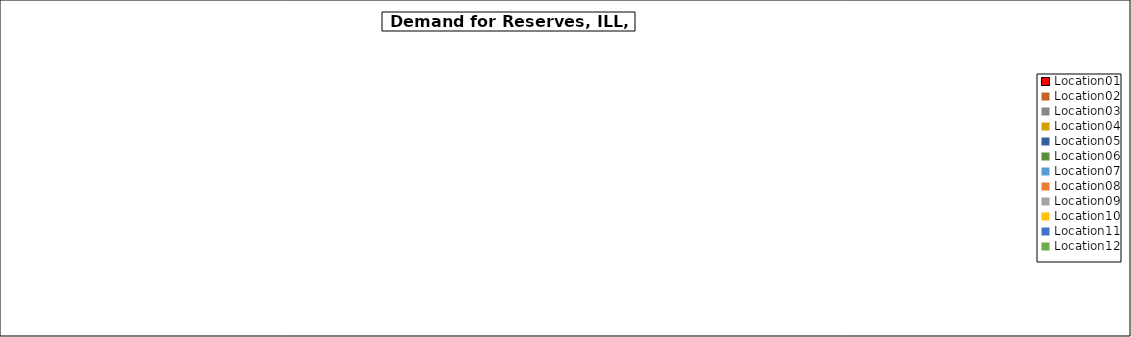
| Category | Series 0 |
|---|---|
| Location01 | 0 |
| Location02 | 0 |
| Location03 | 0 |
| Location04 | 0 |
| Location05 | 0 |
| Location06 | 0 |
| Location07 | 0 |
| Location08 | 0 |
| Location09 | 0 |
| Location10 | 0 |
| Location11 | 0 |
| Location12 | 0 |